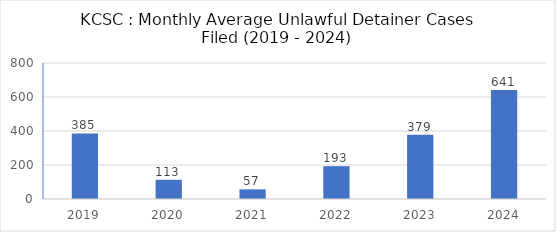
| Category | Series 0 |
|---|---|
| 2019.0 | 385.417 |
| 2020.0 | 113 |
| 2021.0 | 56.833 |
| 2022.0 | 193.083 |
| 2023.0 | 378.5 |
| 2024.0 | 641.167 |